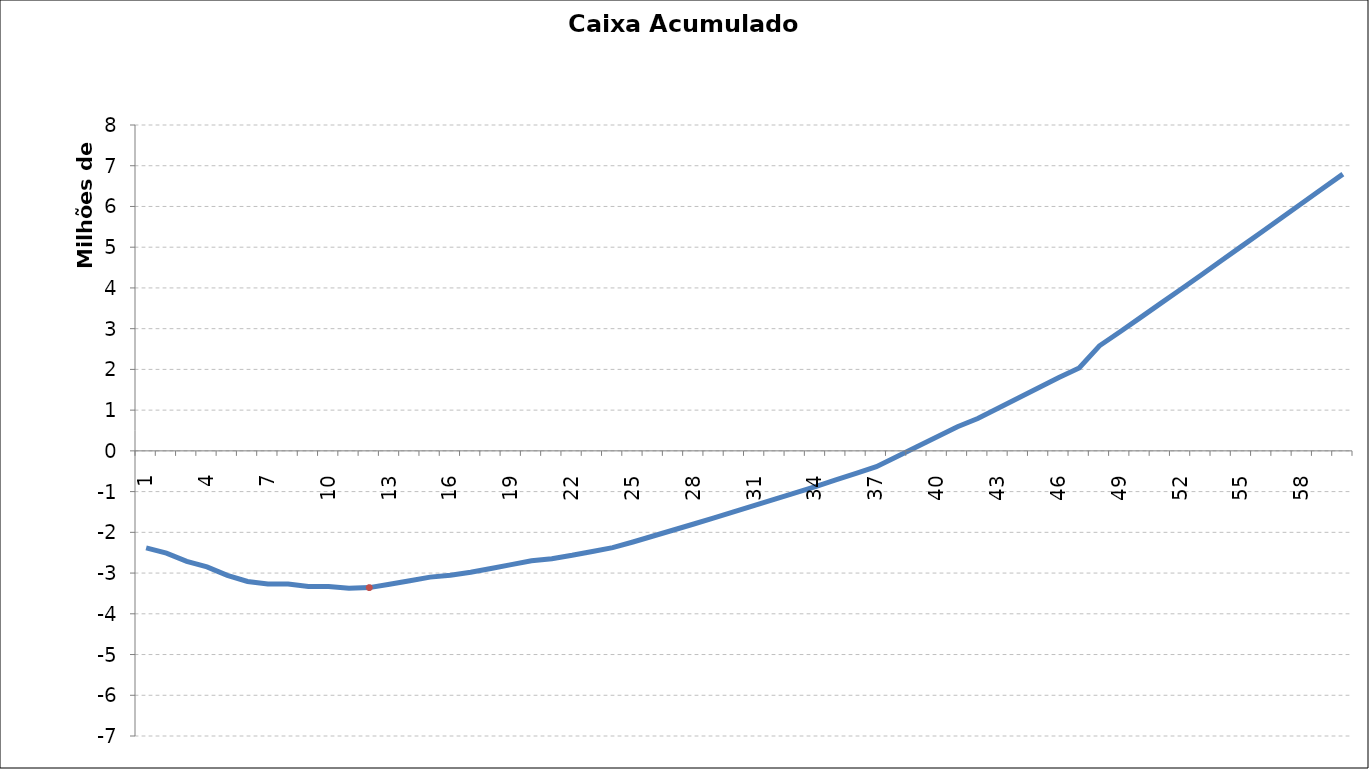
| Category | Caixa Acumulado [R$] |
|---|---|
| 0 | -2382068.03 |
| 1 | -2512036.09 |
| 2 | -2712404.18 |
| 3 | -2847772.3 |
| 4 | -3057513.45 |
| 5 | -3206254.63 |
| 6 | -3269055.742 |
| 7 | -3267604.497 |
| 8 | -3330405.669 |
| 9 | -3328954.463 |
| 10 | -3371755.695 |
| 11 | -3357104.528 |
| 12 | -3273480.02 |
| 13 | -3186555.532 |
| 14 | -3099631.064 |
| 15 | -3055606.615 |
| 16 | -2980430.186 |
| 17 | -2886245.777 |
| 18 | -2792061.388 |
| 19 | -2697877.019 |
| 20 | -2646592.669 |
| 21 | -2564156.339 |
| 22 | -2469972.029 |
| 23 | -2375787.739 |
| 24 | -2237893.587 |
| 25 | -2090231.455 |
| 26 | -1942569.343 |
| 27 | -1794907.25 |
| 28 | -1647245.177 |
| 29 | -1492983.124 |
| 30 | -1338721.091 |
| 31 | -1184459.078 |
| 32 | -1030197.084 |
| 33 | -875935.11 |
| 34 | -715073.156 |
| 35 | -554211.222 |
| 36 | -388748.386 |
| 37 | -143663.169 |
| 38 | 101422.027 |
| 39 | 346507.204 |
| 40 | 591592.361 |
| 41 | 793223.098 |
| 42 | 1044908.216 |
| 43 | 1296593.314 |
| 44 | 1548278.391 |
| 45 | 1799963.449 |
| 46 | 2035914.088 |
| 47 | 2579512.706 |
| 48 | 2917928.44 |
| 49 | 3266112.154 |
| 50 | 3614295.848 |
| 51 | 3962479.523 |
| 52 | 4310663.178 |
| 53 | 4665446.813 |
| 54 | 5020230.428 |
| 55 | 5375014.023 |
| 56 | 5730127.598 |
| 57 | 6084911.154 |
| 58 | 6439694.69 |
| 59 | 6794478.206 |